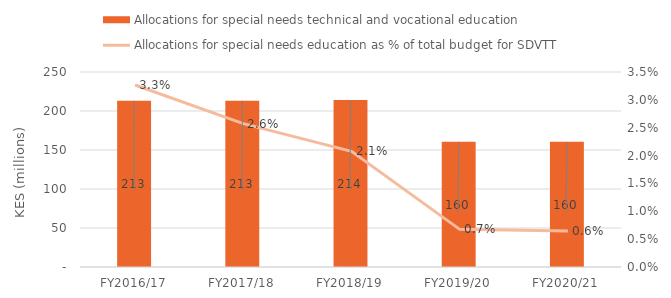
| Category | Allocations for special needs technical and vocational education |
|---|---|
| FY2016/17 | 213151052 |
| FY2017/18 | 213151052 |
| FY2018/19 | 214147084 |
| FY2019/20 | 160451052 |
| FY2020/21 | 160451052 |